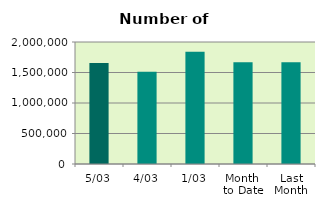
| Category | Series 0 |
|---|---|
| 5/03 | 1653910 |
| 4/03 | 1510694 |
| 1/03 | 1841610 |
| Month 
to Date | 1668738 |
| Last
Month | 1666801.1 |